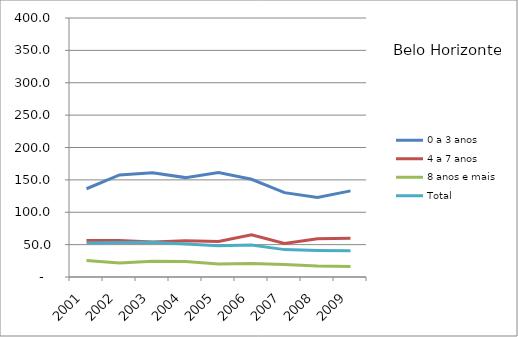
| Category | 0 a 3 anos | 4 a 7 anos | 8 anos e mais | Total |
|---|---|---|---|---|
| 2001.0 | 136.3 | 56.3 | 25.5 | 52.5 |
| 2002.0 | 157.6 | 56.5 | 21.7 | 53.1 |
| 2003.0 | 160.9 | 54 | 24.5 | 53.7 |
| 2004.0 | 153.5 | 55.8 | 23.9 | 50.9 |
| 2005.0 | 161.2 | 54.7 | 20.2 | 48.2 |
| 2006.0 | 150.9 | 65.3 | 20.7 | 49.4 |
| 2007.0 | 130.3 | 51.9 | 19.3 | 42.3 |
| 2008.0 | 122.9 | 59.1 | 17 | 41 |
| 2009.0 | 133 | 59.8 | 16.1 | 40.7 |